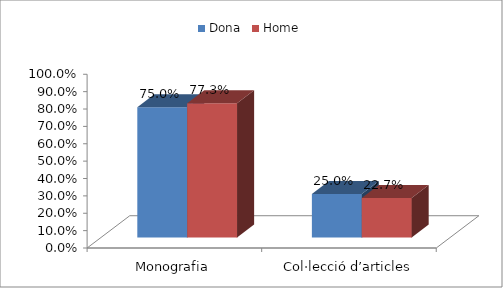
| Category | Dona | Home |
|---|---|---|
| Monografia | 0.75 | 0.773 |
| Col·lecció d’articles | 0.25 | 0.227 |